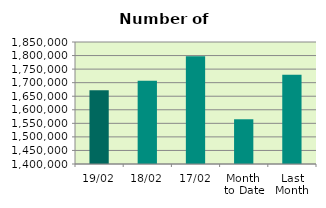
| Category | Series 0 |
|---|---|
| 19/02 | 1671656 |
| 18/02 | 1707080 |
| 17/02 | 1797254 |
| Month 
to Date | 1564973.333 |
| Last
Month | 1728874.4 |